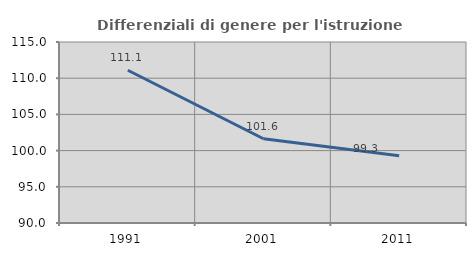
| Category | Differenziali di genere per l'istruzione superiore |
|---|---|
| 1991.0 | 111.1 |
| 2001.0 | 101.639 |
| 2011.0 | 99.29 |